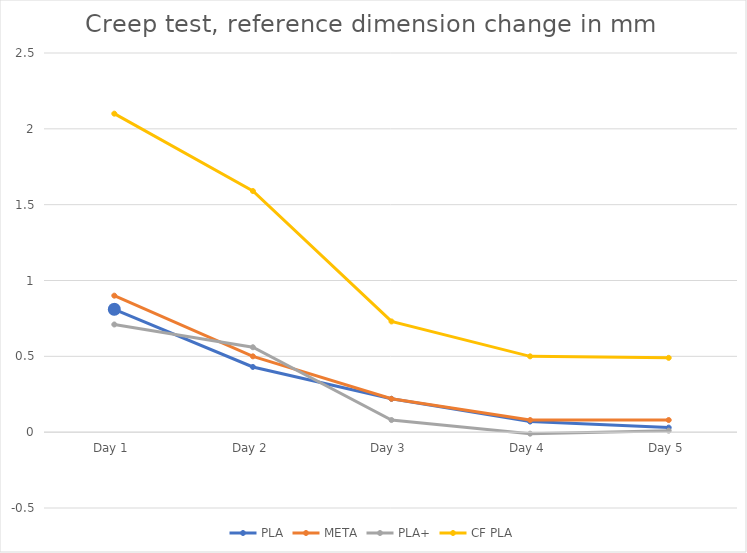
| Category | PLA | META | PLA+ | CF PLA |
|---|---|---|---|---|
| Day 1 | 0.81 | 0.9 | 0.71 | 2.1 |
| Day 2 | 0.43 | 0.5 | 0.56 | 1.59 |
| Day 3 | 0.22 | 0.22 | 0.08 | 0.73 |
| Day 4 | 0.07 | 0.08 | -0.01 | 0.5 |
| Day 5 | 0.03 | 0.08 | 0.01 | 0.49 |